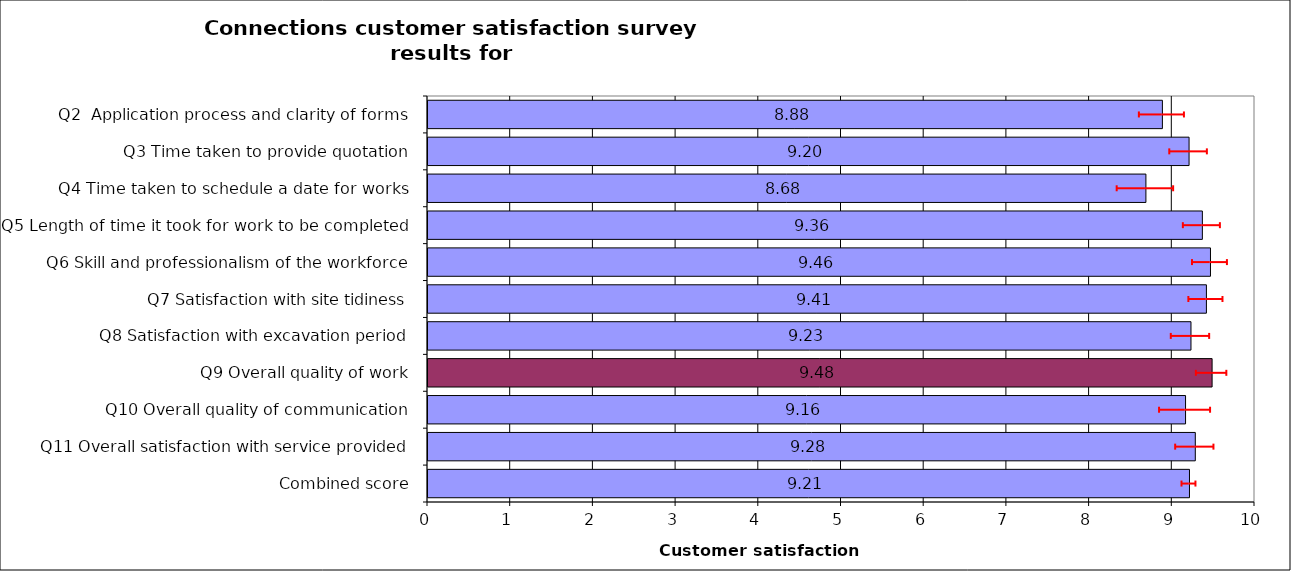
| Category | Series 0 |
|---|---|
| Q2  Application process and clarity of forms | 8.88 |
| Q3 Time taken to provide quotation | 9.203 |
| Q4 Time taken to schedule a date for works | 8.681 |
| Q5 Length of time it took for work to be completed | 9.364 |
| Q6 Skill and professionalism of the workforce | 9.462 |
| Q7 Satisfaction with site tidiness | 9.413 |
| Q8 Satisfaction with excavation period | 9.226 |
| Q9 Overall quality of work | 9.481 |
| Q10 Overall quality of communication | 9.16 |
| Q11 Overall satisfaction with service provided | 9.278 |
| Combined score | 9.208 |